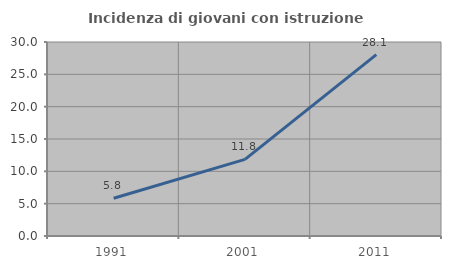
| Category | Incidenza di giovani con istruzione universitaria |
|---|---|
| 1991.0 | 5.83 |
| 2001.0 | 11.842 |
| 2011.0 | 28.053 |